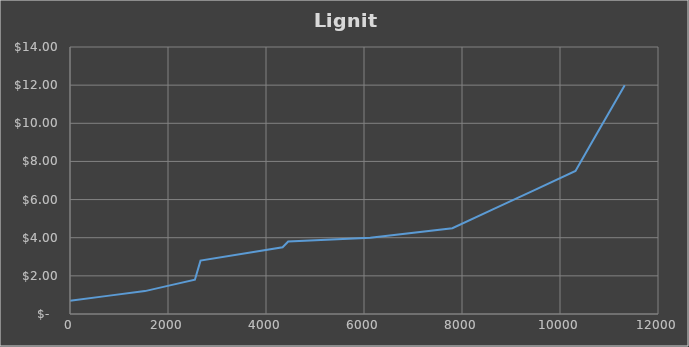
| Category | Series 0 |
|---|---|
| 0.0 | 0.7 |
| 764.5 | 0.95 |
| 1529.0 | 1.2 |
| 2039.0 | 1.5 |
| 2549.0 | 1.8 |
| 2663.5 | 2.8 |
| 4338.64 | 3.5 |
| 4453.14 | 3.8 |
| 6128.280000000001 | 4 |
| 7803.420000000001 | 4.5 |
| 8640.990000000002 | 5.5 |
| 9478.560000000001 | 6.5 |
| 10316.130000000001 | 7.5 |
| 10651.158000000001 | 9 |
| 10986.186000000002 | 10.5 |
| 11321.214000000002 | 12 |